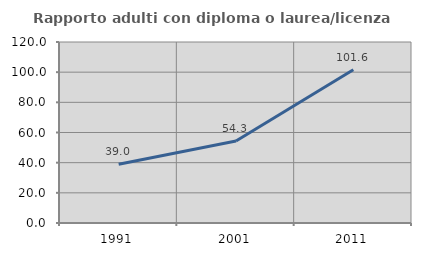
| Category | Rapporto adulti con diploma o laurea/licenza media  |
|---|---|
| 1991.0 | 39 |
| 2001.0 | 54.315 |
| 2011.0 | 101.577 |